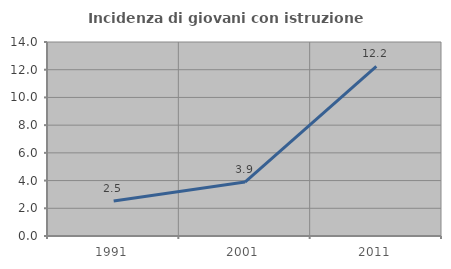
| Category | Incidenza di giovani con istruzione universitaria |
|---|---|
| 1991.0 | 2.532 |
| 2001.0 | 3.896 |
| 2011.0 | 12.245 |